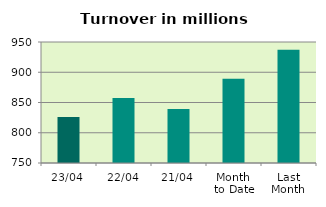
| Category | Series 0 |
|---|---|
| 23/04 | 826.204 |
| 22/04 | 857.517 |
| 21/04 | 839.161 |
| Month 
to Date | 889.234 |
| Last
Month | 937.305 |